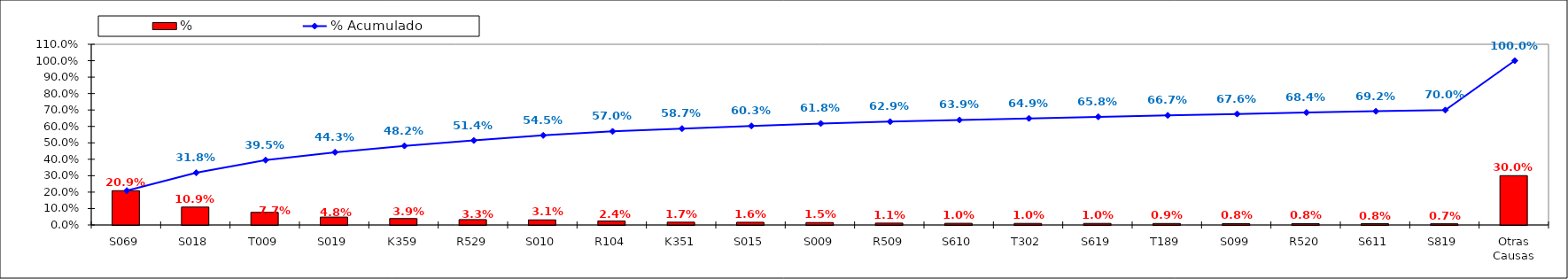
| Category | % |
|---|---|
| S069 | 0.209 |
| S018 | 0.109 |
| T009 | 0.077 |
| S019 | 0.048 |
| K359 | 0.039 |
| R529 | 0.033 |
| S010 | 0.031 |
| R104 | 0.024 |
| K351 | 0.017 |
| S015 | 0.016 |
| S009 | 0.015 |
| R509 | 0.011 |
| S610 | 0.01 |
| T302 | 0.01 |
| S619 | 0.01 |
| T189 | 0.009 |
| S099 | 0.008 |
| R520 | 0.008 |
| S611 | 0.008 |
| S819 | 0.007 |
| Otras Causas | 0.3 |